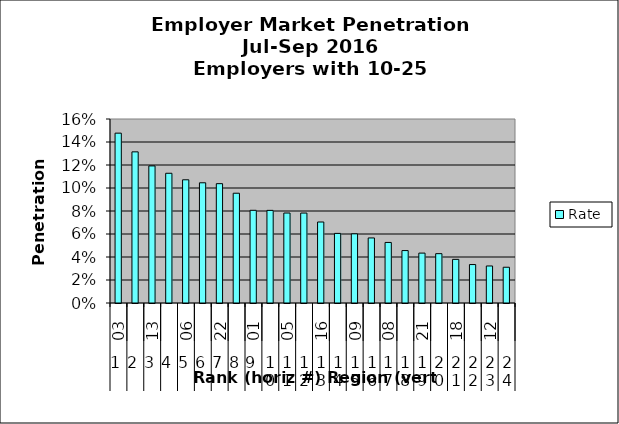
| Category | Rate |
|---|---|
| 0 | 0.148 |
| 1 | 0.131 |
| 2 | 0.119 |
| 3 | 0.113 |
| 4 | 0.107 |
| 5 | 0.105 |
| 6 | 0.104 |
| 7 | 0.095 |
| 8 | 0.081 |
| 9 | 0.081 |
| 10 | 0.078 |
| 11 | 0.078 |
| 12 | 0.07 |
| 13 | 0.061 |
| 14 | 0.06 |
| 15 | 0.057 |
| 16 | 0.053 |
| 17 | 0.046 |
| 18 | 0.043 |
| 19 | 0.043 |
| 20 | 0.038 |
| 21 | 0.033 |
| 22 | 0.032 |
| 23 | 0.031 |